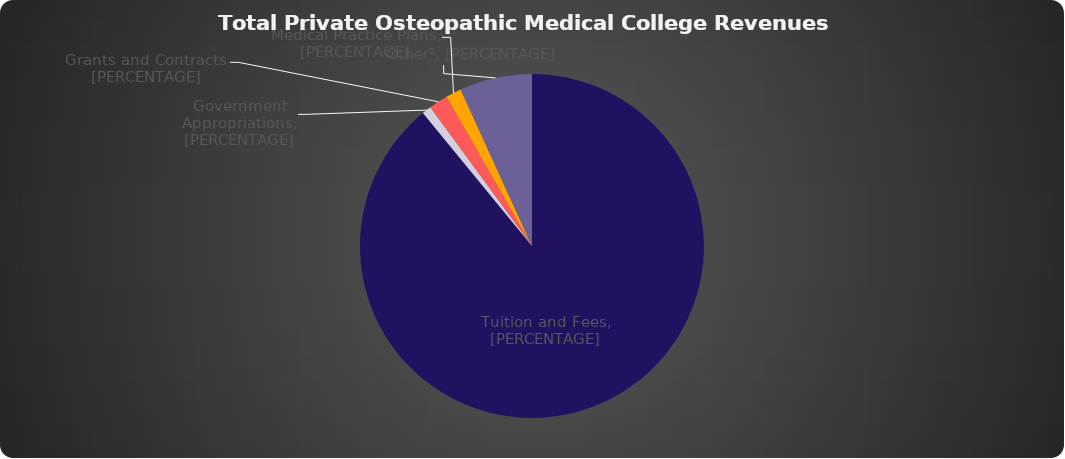
| Category | Series 0 |
|---|---|
| 0 | 1444701054.87 |
| 1 | 14193339.15 |
| 2 | 28855786.92 |
| 3 | 23892926 |
| 4 | 110443873.43 |